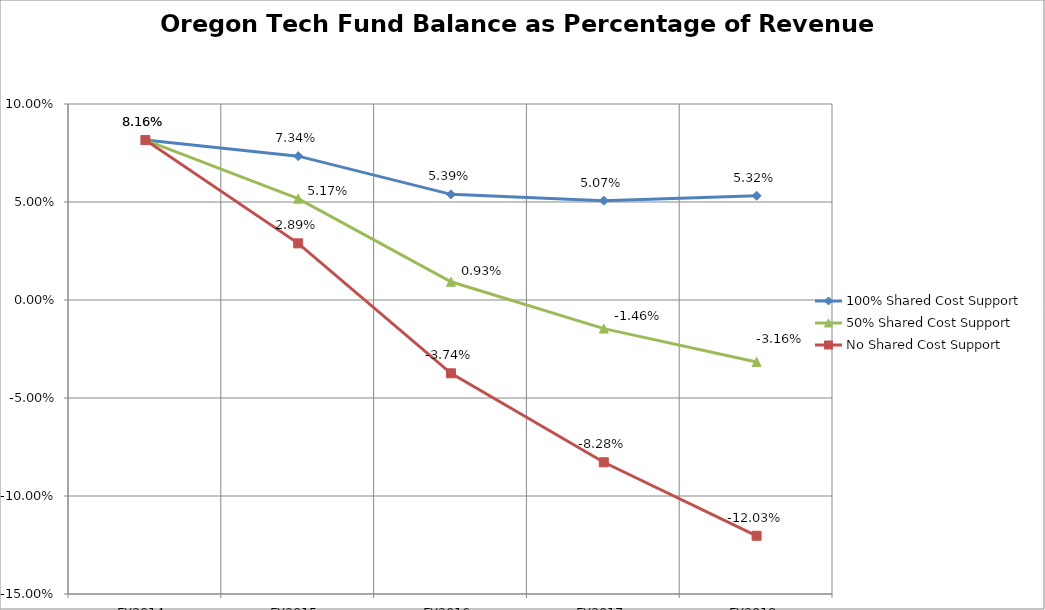
| Category | 100% Shared Cost Support | 50% Shared Cost Support | No Shared Cost Support |
|---|---|---|---|
| FY2014 | 0.082 | 0.082 | 0.082 |
| FY2015 | 0.073 | 0.052 | 0.029 |
| FY2016 | 0.054 | 0.009 | -0.037 |
| FY2017 | 0.051 | -0.015 | -0.083 |
| FY2018 | 0.053 | -0.032 | -0.12 |